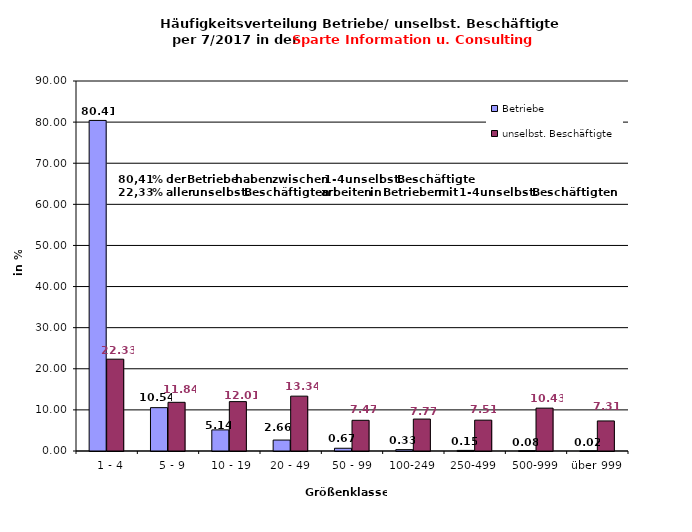
| Category | Betriebe | unselbst. Beschäftigte |
|---|---|---|
|   1 - 4 | 80.408 | 22.333 |
|   5 - 9 | 10.545 | 11.841 |
|  10 - 19 | 5.137 | 12.01 |
| 20 - 49 | 2.662 | 13.341 |
| 50 - 99 | 0.666 | 7.466 |
| 100-249 | 0.333 | 7.765 |
| 250-499 | 0.146 | 7.506 |
| 500-999 | 0.083 | 10.427 |
| über 999 | 0.021 | 7.311 |